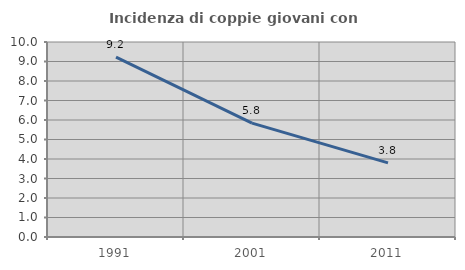
| Category | Incidenza di coppie giovani con figli |
|---|---|
| 1991.0 | 9.226 |
| 2001.0 | 5.842 |
| 2011.0 | 3.799 |